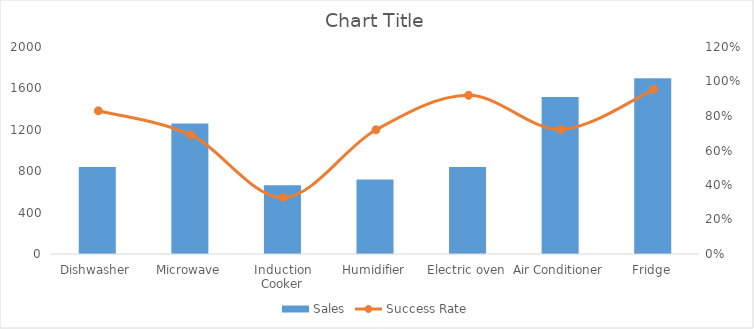
| Category | Sales |
|---|---|
| Dishwasher | 840 |
| Microwave | 1262 |
| Induction Cooker | 664 |
| Humidifier | 721 |
| Electric oven | 840 |
| Air Conditioner | 1518 |
| Fridge | 1698 |